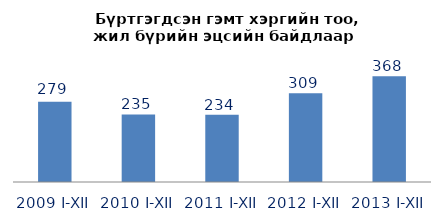
| Category | Á¿ðòãýãäñýí ãýìò õýðýã |
|---|---|
| 2009 I-XII | 279 |
| 2010 I-XII | 235 |
| 2011 I-XII | 234 |
| 2012 I-XII | 309 |
| 2013 I-XII | 368 |